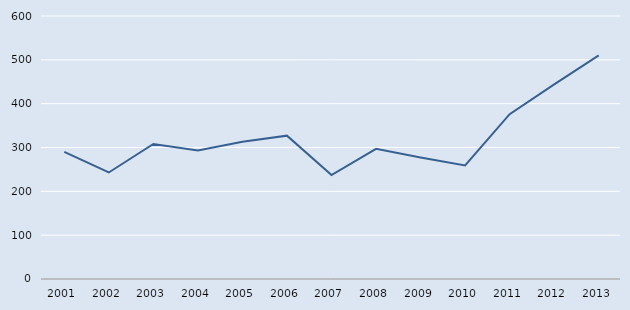
| Category | Series 0 |
|---|---|
| 2001.0 | 290 |
| 2002.0 | 243 |
| 2003.0 | 308 |
| 2004.0 | 293 |
| 2005.0 | 313 |
| 2006.0 | 327 |
| 2007.0 | 237 |
| 2008.0 | 297 |
| 2009.0 | 277 |
| 2010.0 | 259 |
| 2011.0 | 376 |
| 2012.0 | 444 |
| 2013.0 | 510 |